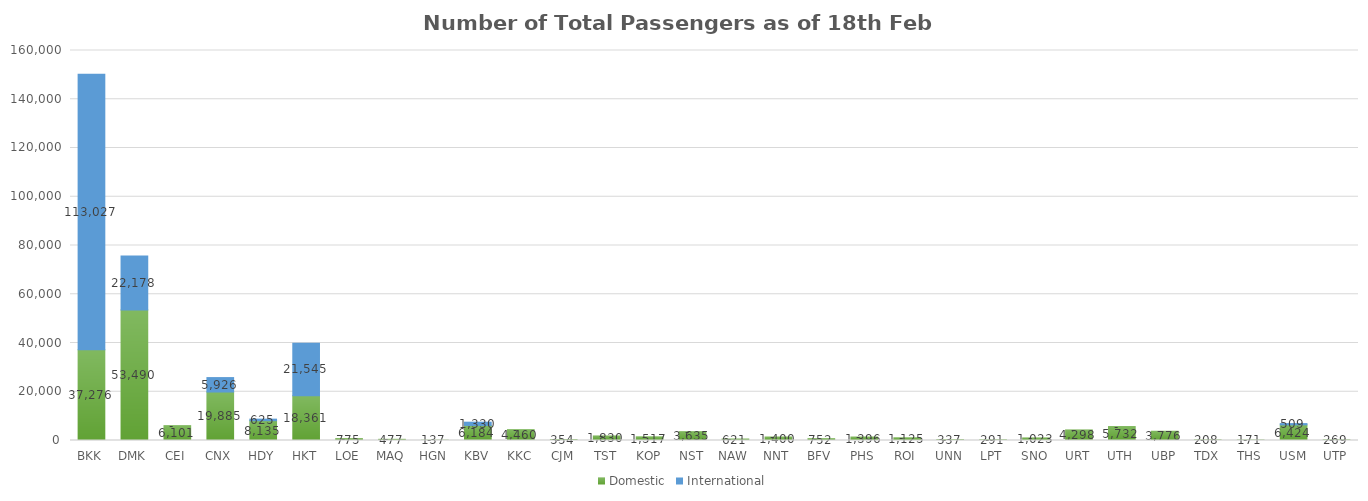
| Category | Domestic | International |
|---|---|---|
| BKK | 37276 | 113027 |
| DMK | 53490 | 22178 |
| CEI | 6101 | 0 |
| CNX | 19885 | 5926 |
| HDY | 8135 | 625 |
| HKT | 18361 | 21545 |
| LOE | 775 | 0 |
| MAQ | 477 | 0 |
| HGN | 137 | 0 |
| KBV | 6184 | 1330 |
| KKC | 4460 | 0 |
| CJM | 354 | 0 |
| TST | 1830 | 0 |
| KOP | 1517 | 0 |
| NST | 3635 | 0 |
| NAW | 621 | 0 |
| NNT | 1400 | 0 |
| BFV | 752 | 0 |
| PHS | 1396 | 0 |
| ROI | 1125 | 0 |
| UNN | 337 | 0 |
| LPT | 291 | 0 |
| SNO | 1023 | 0 |
| URT | 4298 | 0 |
| UTH | 5732 | 0 |
| UBP | 3776 | 0 |
| TDX | 208 | 0 |
| THS | 171 | 0 |
| USM | 6424 | 509 |
| UTP | 269 | 0 |